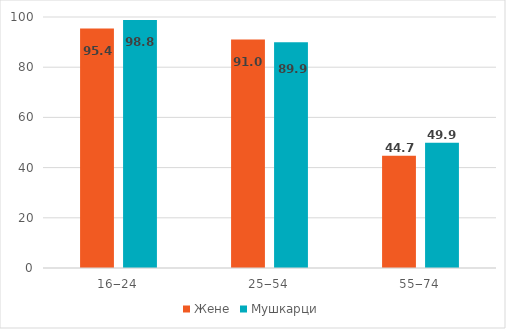
| Category | Жене | Мушкарци |
|---|---|---|
| 16‒24 | 95.4 | 98.8 |
| 25‒54 | 91 | 89.9 |
| 55‒74 | 44.7 | 49.9 |